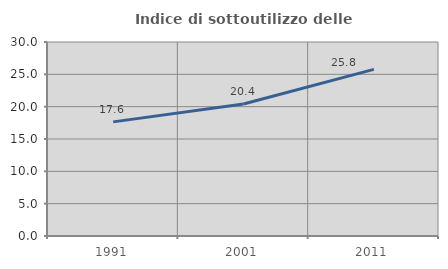
| Category | Indice di sottoutilizzo delle abitazioni  |
|---|---|
| 1991.0 | 17.647 |
| 2001.0 | 20.421 |
| 2011.0 | 25.765 |